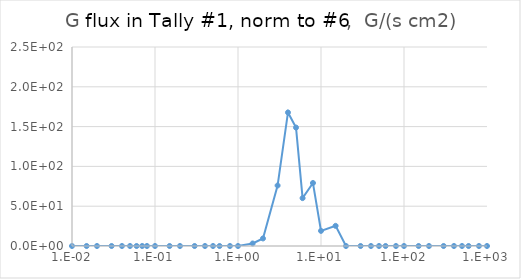
| Category | Series 0 |
|---|---|
| 0.01 | 0 |
| 0.015 | 0 |
| 0.02 | 0 |
| 0.03 | 0 |
| 0.04 | 0 |
| 0.05 | 0 |
| 0.06 | 0 |
| 0.07 | 0 |
| 0.08 | 0 |
| 0.1 | 0 |
| 0.15 | 0 |
| 0.2 | 0 |
| 0.3 | 0 |
| 0.4 | 0 |
| 0.5 | 0 |
| 0.6 | 0 |
| 0.8 | 0 |
| 1.0 | 0 |
| 1.5 | 0 |
| 2.0 | 0 |
| 3.0 | 235.534 |
| 4.0 | 117.767 |
| 5.0 | 0 |
| 6.0 | 117.767 |
| 8.0 | 117.767 |
| 10.0 | 0 |
| 15.0 | 0 |
| 20.0 | 0 |
| 30.0 | 0 |
| 40.0 | 0 |
| 50.0 | 0 |
| 60.0 | 0 |
| 80.0 | 0 |
| 100.0 | 0 |
| 150.0 | 0 |
| 200.0 | 0 |
| 300.0 | 0 |
| 400.0 | 0 |
| 500.0 | 0 |
| 600.0 | 0 |
| 800.0 | 0 |
| 1000.0 | 0 |
| 1500.0 | 0 |
| 2000.0 | 0 |
| 3000.0 | 0 |
| 4000.0 | 0 |
| 5000.0 | 0 |
| 6000.0 | 0 |
| 8000.0 | 0 |
| 10000.0 | 0 |